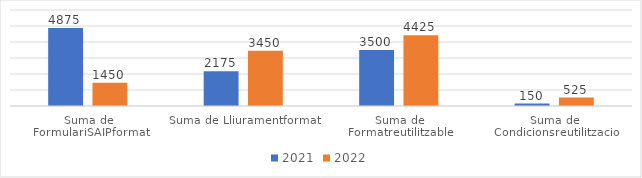
| Category | 2021 | 2022 |
|---|---|---|
| Suma de FormulariSAIPformat | 4875 | 1450 |
| Suma de Lliuramentformat | 2175 | 3450 |
| Suma de Formatreutilitzable | 3500 | 4425 |
| Suma de Condicionsreutilitzacio | 150 | 525 |